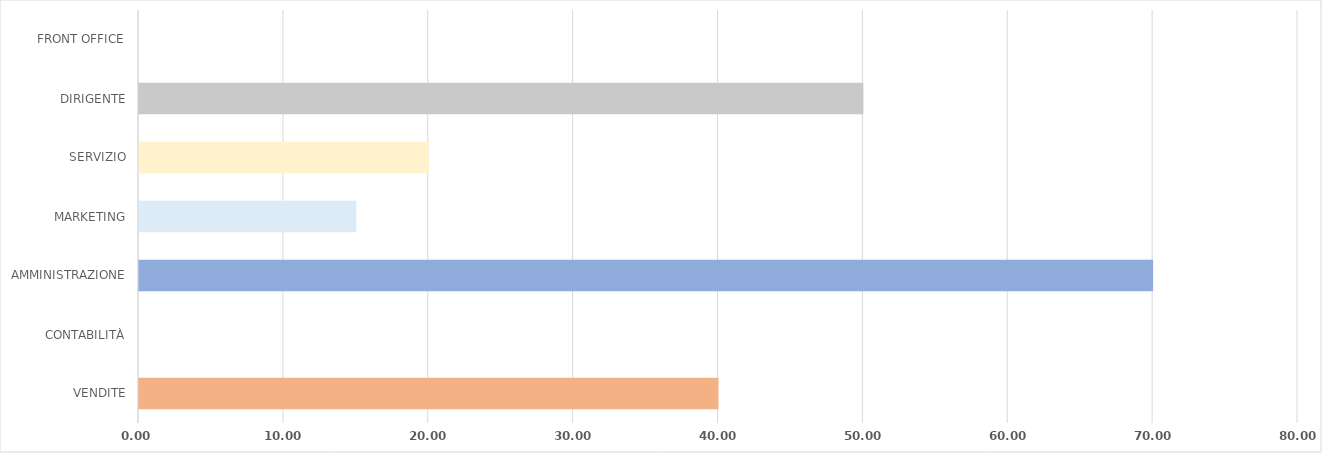
| Category | Series 0 |
|---|---|
| VENDITE | 40 |
| CONTABILITÀ | 0 |
| AMMINISTRAZIONE | 70 |
| MARKETING | 15 |
| SERVIZIO | 20 |
| DIRIGENTE | 50 |
| FRONT OFFICE | 0 |